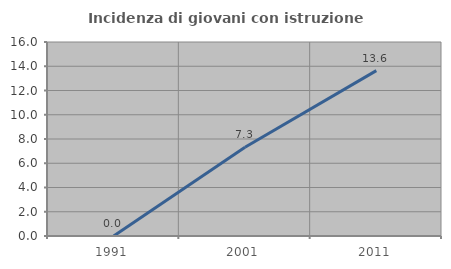
| Category | Incidenza di giovani con istruzione universitaria |
|---|---|
| 1991.0 | 0 |
| 2001.0 | 7.317 |
| 2011.0 | 13.636 |